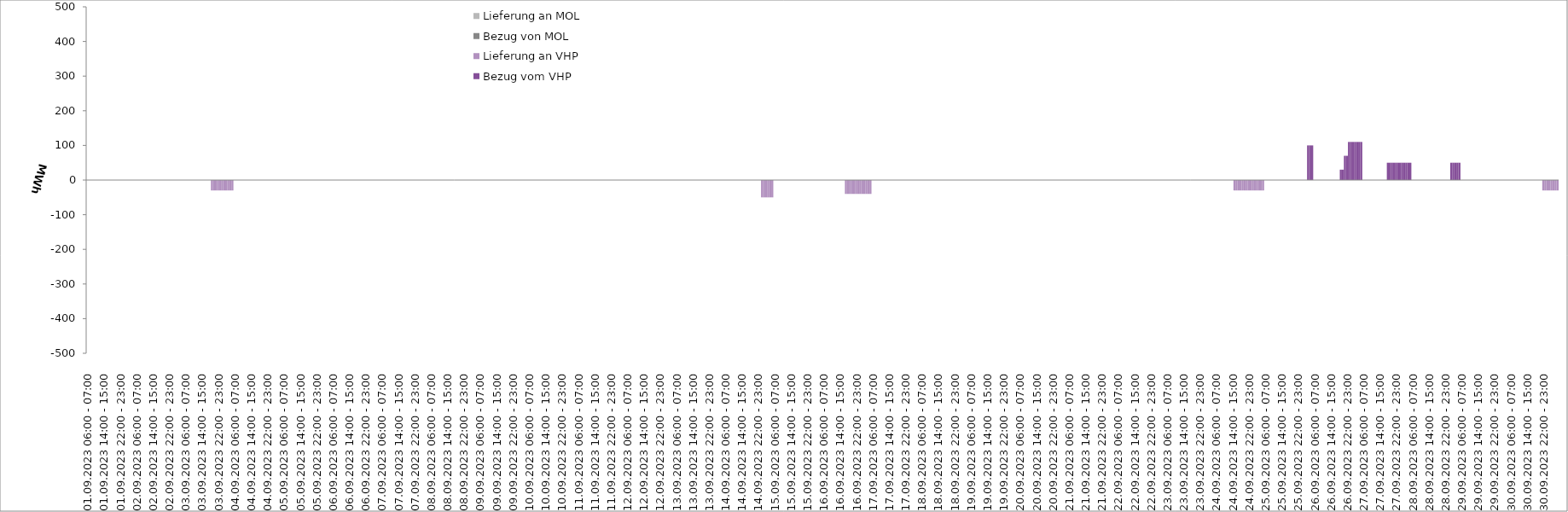
| Category | Bezug vom VHP | Lieferung an VHP | Bezug von MOL | Lieferung an MOL |
|---|---|---|---|---|
| 01.09.2023 06:00 - 07:00 | 0 | 0 | 0 | 0 |
| 01.09.2023 07:00 - 08:00 | 0 | 0 | 0 | 0 |
| 01.09.2023 08:00 - 09:00 | 0 | 0 | 0 | 0 |
| 01.09.2023 09:00 - 10:00 | 0 | 0 | 0 | 0 |
| 01.09.2023 10:00 - 11:00 | 0 | 0 | 0 | 0 |
| 01.09.2023 11:00 - 12:00 | 0 | 0 | 0 | 0 |
| 01.09.2023 12:00 - 13:00 | 0 | 0 | 0 | 0 |
| 01.09.2023 13:00 - 14:00 | 0 | 0 | 0 | 0 |
| 01.09.2023 14:00 - 15:00 | 0 | 0 | 0 | 0 |
| 01.09.2023 15:00 - 16:00 | 0 | 0 | 0 | 0 |
| 01.09.2023 16:00 - 17:00 | 0 | 0 | 0 | 0 |
| 01.09.2023 17:00 - 18:00 | 0 | 0 | 0 | 0 |
| 01.09.2023 18:00 - 19:00 | 0 | 0 | 0 | 0 |
| 01.09.2023 19:00 - 20:00 | 0 | 0 | 0 | 0 |
| 01.09.2023 20:00 - 21:00 | 0 | 0 | 0 | 0 |
| 01.09.2023 21:00 - 22:00 | 0 | 0 | 0 | 0 |
| 01.09.2023 22:00 - 23:00 | 0 | 0 | 0 | 0 |
| 01.09.2023 23:00 - 24:00 | 0 | 0 | 0 | 0 |
| 02.09.2023 00:00 - 01:00 | 0 | 0 | 0 | 0 |
| 02.09.2023 01:00 - 02:00 | 0 | 0 | 0 | 0 |
| 02.09.2023 02:00 - 03:00 | 0 | 0 | 0 | 0 |
| 02.09.2023 03:00 - 04:00 | 0 | 0 | 0 | 0 |
| 02.09.2023 04:00 - 05:00 | 0 | 0 | 0 | 0 |
| 02.09.2023 05:00 - 06:00 | 0 | 0 | 0 | 0 |
| 02.09.2023 06:00 - 07:00 | 0 | 0 | 0 | 0 |
| 02.09.2023 07:00 - 08:00 | 0 | 0 | 0 | 0 |
| 02.09.2023 08:00 - 09:00 | 0 | 0 | 0 | 0 |
| 02.09.2023 09:00 - 10:00 | 0 | 0 | 0 | 0 |
| 02.09.2023 10:00 - 11:00 | 0 | 0 | 0 | 0 |
| 02.09.2023 11:00 - 12:00 | 0 | 0 | 0 | 0 |
| 02.09.2023 12:00 - 13:00 | 0 | 0 | 0 | 0 |
| 02.09.2023 13:00 - 14:00 | 0 | 0 | 0 | 0 |
| 02.09.2023 14:00 - 15:00 | 0 | 0 | 0 | 0 |
| 02.09.2023 15:00 - 16:00 | 0 | 0 | 0 | 0 |
| 02.09.2023 16:00 - 17:00 | 0 | 0 | 0 | 0 |
| 02.09.2023 17:00 - 18:00 | 0 | 0 | 0 | 0 |
| 02.09.2023 18:00 - 19:00 | 0 | 0 | 0 | 0 |
| 02.09.2023 19:00 - 20:00 | 0 | 0 | 0 | 0 |
| 02.09.2023 20:00 - 21:00 | 0 | 0 | 0 | 0 |
| 02.09.2023 21:00 - 22:00 | 0 | 0 | 0 | 0 |
| 02.09.2023 22:00 - 23:00 | 0 | 0 | 0 | 0 |
| 02.09.2023 23:00 - 24:00 | 0 | 0 | 0 | 0 |
| 03.09.2023 00:00 - 01:00 | 0 | 0 | 0 | 0 |
| 03.09.2023 01:00 - 02:00 | 0 | 0 | 0 | 0 |
| 03.09.2023 02:00 - 03:00 | 0 | 0 | 0 | 0 |
| 03.09.2023 03:00 - 04:00 | 0 | 0 | 0 | 0 |
| 03.09.2023 04:00 - 05:00 | 0 | 0 | 0 | 0 |
| 03.09.2023 05:00 - 06:00 | 0 | 0 | 0 | 0 |
| 03.09.2023 06:00 - 07:00 | 0 | 0 | 0 | 0 |
| 03.09.2023 07:00 - 08:00 | 0 | 0 | 0 | 0 |
| 03.09.2023 08:00 - 09:00 | 0 | 0 | 0 | 0 |
| 03.09.2023 09:00 - 10:00 | 0 | 0 | 0 | 0 |
| 03.09.2023 10:00 - 11:00 | 0 | 0 | 0 | 0 |
| 03.09.2023 11:00 - 12:00 | 0 | 0 | 0 | 0 |
| 03.09.2023 12:00 - 13:00 | 0 | 0 | 0 | 0 |
| 03.09.2023 13:00 - 14:00 | 0 | 0 | 0 | 0 |
| 03.09.2023 14:00 - 15:00 | 0 | 0 | 0 | 0 |
| 03.09.2023 15:00 - 16:00 | 0 | 0 | 0 | 0 |
| 03.09.2023 16:00 - 17:00 | 0 | 0 | 0 | 0 |
| 03.09.2023 17:00 - 18:00 | 0 | 0 | 0 | 0 |
| 03.09.2023 18:00 - 19:00 | 0 | 0 | 0 | 0 |
| 03.09.2023 19:00 - 20:00 | 0 | -30 | 0 | 0 |
| 03.09.2023 20:00 - 21:00 | 0 | -30 | 0 | 0 |
| 03.09.2023 21:00 - 22:00 | 0 | -30 | 0 | 0 |
| 03.09.2023 22:00 - 23:00 | 0 | -30 | 0 | 0 |
| 03.09.2023 23:00 - 24:00 | 0 | -30 | 0 | 0 |
| 04.09.2023 00:00 - 01:00 | 0 | -30 | 0 | 0 |
| 04.09.2023 01:00 - 02:00 | 0 | -30 | 0 | 0 |
| 04.09.2023 02:00 - 03:00 | 0 | -30 | 0 | 0 |
| 04.09.2023 03:00 - 04:00 | 0 | -30 | 0 | 0 |
| 04.09.2023 04:00 - 05:00 | 0 | -30 | 0 | 0 |
| 04.09.2023 05:00 - 06:00 | 0 | -30 | 0 | 0 |
| 04.09.2023 06:00 - 07:00 | 0 | 0 | 0 | 0 |
| 04.09.2023 07:00 - 08:00 | 0 | 0 | 0 | 0 |
| 04.09.2023 08:00 - 09:00 | 0 | 0 | 0 | 0 |
| 04.09.2023 09:00 - 10:00 | 0 | 0 | 0 | 0 |
| 04.09.2023 10:00 - 11:00 | 0 | 0 | 0 | 0 |
| 04.09.2023 11:00 - 12:00 | 0 | 0 | 0 | 0 |
| 04.09.2023 12:00 - 13:00 | 0 | 0 | 0 | 0 |
| 04.09.2023 13:00 - 14:00 | 0 | 0 | 0 | 0 |
| 04.09.2023 14:00 - 15:00 | 0 | 0 | 0 | 0 |
| 04.09.2023 15:00 - 16:00 | 0 | 0 | 0 | 0 |
| 04.09.2023 16:00 - 17:00 | 0 | 0 | 0 | 0 |
| 04.09.2023 17:00 - 18:00 | 0 | 0 | 0 | 0 |
| 04.09.2023 18:00 - 19:00 | 0 | 0 | 0 | 0 |
| 04.09.2023 19:00 - 20:00 | 0 | 0 | 0 | 0 |
| 04.09.2023 20:00 - 21:00 | 0 | 0 | 0 | 0 |
| 04.09.2023 21:00 - 22:00 | 0 | 0 | 0 | 0 |
| 04.09.2023 22:00 - 23:00 | 0 | 0 | 0 | 0 |
| 04.09.2023 23:00 - 24:00 | 0 | 0 | 0 | 0 |
| 05.09.2023 00:00 - 01:00 | 0 | 0 | 0 | 0 |
| 05.09.2023 01:00 - 02:00 | 0 | 0 | 0 | 0 |
| 05.09.2023 02:00 - 03:00 | 0 | 0 | 0 | 0 |
| 05.09.2023 03:00 - 04:00 | 0 | 0 | 0 | 0 |
| 05.09.2023 04:00 - 05:00 | 0 | 0 | 0 | 0 |
| 05.09.2023 05:00 - 06:00 | 0 | 0 | 0 | 0 |
| 05.09.2023 06:00 - 07:00 | 0 | 0 | 0 | 0 |
| 05.09.2023 07:00 - 08:00 | 0 | 0 | 0 | 0 |
| 05.09.2023 08:00 - 09:00 | 0 | 0 | 0 | 0 |
| 05.09.2023 09:00 - 10:00 | 0 | 0 | 0 | 0 |
| 05.09.2023 10:00 - 11:00 | 0 | 0 | 0 | 0 |
| 05.09.2023 11:00 - 12:00 | 0 | 0 | 0 | 0 |
| 05.09.2023 12:00 - 13:00 | 0 | 0 | 0 | 0 |
| 05.09.2023 13:00 - 14:00 | 0 | 0 | 0 | 0 |
| 05.09.2023 14:00 - 15:00 | 0 | 0 | 0 | 0 |
| 05.09.2023 15:00 - 16:00 | 0 | 0 | 0 | 0 |
| 05.09.2023 16:00 - 17:00 | 0 | 0 | 0 | 0 |
| 05.09.2023 17:00 - 18:00 | 0 | 0 | 0 | 0 |
| 05.09.2023 18:00 - 19:00 | 0 | 0 | 0 | 0 |
| 05.09.2023 19:00 - 20:00 | 0 | 0 | 0 | 0 |
| 05.09.2023 20:00 - 21:00 | 0 | 0 | 0 | 0 |
| 05.09.2023 21:00 - 22:00 | 0 | 0 | 0 | 0 |
| 05.09.2023 22:00 - 23:00 | 0 | 0 | 0 | 0 |
| 05.09.2023 23:00 - 24:00 | 0 | 0 | 0 | 0 |
| 06.09.2023 00:00 - 01:00 | 0 | 0 | 0 | 0 |
| 06.09.2023 01:00 - 02:00 | 0 | 0 | 0 | 0 |
| 06.09.2023 02:00 - 03:00 | 0 | 0 | 0 | 0 |
| 06.09.2023 03:00 - 04:00 | 0 | 0 | 0 | 0 |
| 06.09.2023 04:00 - 05:00 | 0 | 0 | 0 | 0 |
| 06.09.2023 05:00 - 06:00 | 0 | 0 | 0 | 0 |
| 06.09.2023 06:00 - 07:00 | 0 | 0 | 0 | 0 |
| 06.09.2023 07:00 - 08:00 | 0 | 0 | 0 | 0 |
| 06.09.2023 08:00 - 09:00 | 0 | 0 | 0 | 0 |
| 06.09.2023 09:00 - 10:00 | 0 | 0 | 0 | 0 |
| 06.09.2023 10:00 - 11:00 | 0 | 0 | 0 | 0 |
| 06.09.2023 11:00 - 12:00 | 0 | 0 | 0 | 0 |
| 06.09.2023 12:00 - 13:00 | 0 | 0 | 0 | 0 |
| 06.09.2023 13:00 - 14:00 | 0 | 0 | 0 | 0 |
| 06.09.2023 14:00 - 15:00 | 0 | 0 | 0 | 0 |
| 06.09.2023 15:00 - 16:00 | 0 | 0 | 0 | 0 |
| 06.09.2023 16:00 - 17:00 | 0 | 0 | 0 | 0 |
| 06.09.2023 17:00 - 18:00 | 0 | 0 | 0 | 0 |
| 06.09.2023 18:00 - 19:00 | 0 | 0 | 0 | 0 |
| 06.09.2023 19:00 - 20:00 | 0 | 0 | 0 | 0 |
| 06.09.2023 20:00 - 21:00 | 0 | 0 | 0 | 0 |
| 06.09.2023 21:00 - 22:00 | 0 | 0 | 0 | 0 |
| 06.09.2023 22:00 - 23:00 | 0 | 0 | 0 | 0 |
| 06.09.2023 23:00 - 24:00 | 0 | 0 | 0 | 0 |
| 07.09.2023 00:00 - 01:00 | 0 | 0 | 0 | 0 |
| 07.09.2023 01:00 - 02:00 | 0 | 0 | 0 | 0 |
| 07.09.2023 02:00 - 03:00 | 0 | 0 | 0 | 0 |
| 07.09.2023 03:00 - 04:00 | 0 | 0 | 0 | 0 |
| 07.09.2023 04:00 - 05:00 | 0 | 0 | 0 | 0 |
| 07.09.2023 05:00 - 06:00 | 0 | 0 | 0 | 0 |
| 07.09.2023 06:00 - 07:00 | 0 | 0 | 0 | 0 |
| 07.09.2023 07:00 - 08:00 | 0 | 0 | 0 | 0 |
| 07.09.2023 08:00 - 09:00 | 0 | 0 | 0 | 0 |
| 07.09.2023 09:00 - 10:00 | 0 | 0 | 0 | 0 |
| 07.09.2023 10:00 - 11:00 | 0 | 0 | 0 | 0 |
| 07.09.2023 11:00 - 12:00 | 0 | 0 | 0 | 0 |
| 07.09.2023 12:00 - 13:00 | 0 | 0 | 0 | 0 |
| 07.09.2023 13:00 - 14:00 | 0 | 0 | 0 | 0 |
| 07.09.2023 14:00 - 15:00 | 0 | 0 | 0 | 0 |
| 07.09.2023 15:00 - 16:00 | 0 | 0 | 0 | 0 |
| 07.09.2023 16:00 - 17:00 | 0 | 0 | 0 | 0 |
| 07.09.2023 17:00 - 18:00 | 0 | 0 | 0 | 0 |
| 07.09.2023 18:00 - 19:00 | 0 | 0 | 0 | 0 |
| 07.09.2023 19:00 - 20:00 | 0 | 0 | 0 | 0 |
| 07.09.2023 20:00 - 21:00 | 0 | 0 | 0 | 0 |
| 07.09.2023 21:00 - 22:00 | 0 | 0 | 0 | 0 |
| 07.09.2023 22:00 - 23:00 | 0 | 0 | 0 | 0 |
| 07.09.2023 23:00 - 24:00 | 0 | 0 | 0 | 0 |
| 08.09.2023 00:00 - 01:00 | 0 | 0 | 0 | 0 |
| 08.09.2023 01:00 - 02:00 | 0 | 0 | 0 | 0 |
| 08.09.2023 02:00 - 03:00 | 0 | 0 | 0 | 0 |
| 08.09.2023 03:00 - 04:00 | 0 | 0 | 0 | 0 |
| 08.09.2023 04:00 - 05:00 | 0 | 0 | 0 | 0 |
| 08.09.2023 05:00 - 06:00 | 0 | 0 | 0 | 0 |
| 08.09.2023 06:00 - 07:00 | 0 | 0 | 0 | 0 |
| 08.09.2023 07:00 - 08:00 | 0 | 0 | 0 | 0 |
| 08.09.2023 08:00 - 09:00 | 0 | 0 | 0 | 0 |
| 08.09.2023 09:00 - 10:00 | 0 | 0 | 0 | 0 |
| 08.09.2023 10:00 - 11:00 | 0 | 0 | 0 | 0 |
| 08.09.2023 11:00 - 12:00 | 0 | 0 | 0 | 0 |
| 08.09.2023 12:00 - 13:00 | 0 | 0 | 0 | 0 |
| 08.09.2023 13:00 - 14:00 | 0 | 0 | 0 | 0 |
| 08.09.2023 14:00 - 15:00 | 0 | 0 | 0 | 0 |
| 08.09.2023 15:00 - 16:00 | 0 | 0 | 0 | 0 |
| 08.09.2023 16:00 - 17:00 | 0 | 0 | 0 | 0 |
| 08.09.2023 17:00 - 18:00 | 0 | 0 | 0 | 0 |
| 08.09.2023 18:00 - 19:00 | 0 | 0 | 0 | 0 |
| 08.09.2023 19:00 - 20:00 | 0 | 0 | 0 | 0 |
| 08.09.2023 20:00 - 21:00 | 0 | 0 | 0 | 0 |
| 08.09.2023 21:00 - 22:00 | 0 | 0 | 0 | 0 |
| 08.09.2023 22:00 - 23:00 | 0 | 0 | 0 | 0 |
| 08.09.2023 23:00 - 24:00 | 0 | 0 | 0 | 0 |
| 09.09.2023 00:00 - 01:00 | 0 | 0 | 0 | 0 |
| 09.09.2023 01:00 - 02:00 | 0 | 0 | 0 | 0 |
| 09.09.2023 02:00 - 03:00 | 0 | 0 | 0 | 0 |
| 09.09.2023 03:00 - 04:00 | 0 | 0 | 0 | 0 |
| 09.09.2023 04:00 - 05:00 | 0 | 0 | 0 | 0 |
| 09.09.2023 05:00 - 06:00 | 0 | 0 | 0 | 0 |
| 09.09.2023 06:00 - 07:00 | 0 | 0 | 0 | 0 |
| 09.09.2023 07:00 - 08:00 | 0 | 0 | 0 | 0 |
| 09.09.2023 08:00 - 09:00 | 0 | 0 | 0 | 0 |
| 09.09.2023 09:00 - 10:00 | 0 | 0 | 0 | 0 |
| 09.09.2023 10:00 - 11:00 | 0 | 0 | 0 | 0 |
| 09.09.2023 11:00 - 12:00 | 0 | 0 | 0 | 0 |
| 09.09.2023 12:00 - 13:00 | 0 | 0 | 0 | 0 |
| 09.09.2023 13:00 - 14:00 | 0 | 0 | 0 | 0 |
| 09.09.2023 14:00 - 15:00 | 0 | 0 | 0 | 0 |
| 09.09.2023 15:00 - 16:00 | 0 | 0 | 0 | 0 |
| 09.09.2023 16:00 - 17:00 | 0 | 0 | 0 | 0 |
| 09.09.2023 17:00 - 18:00 | 0 | 0 | 0 | 0 |
| 09.09.2023 18:00 - 19:00 | 0 | 0 | 0 | 0 |
| 09.09.2023 19:00 - 20:00 | 0 | 0 | 0 | 0 |
| 09.09.2023 20:00 - 21:00 | 0 | 0 | 0 | 0 |
| 09.09.2023 21:00 - 22:00 | 0 | 0 | 0 | 0 |
| 09.09.2023 22:00 - 23:00 | 0 | 0 | 0 | 0 |
| 09.09.2023 23:00 - 24:00 | 0 | 0 | 0 | 0 |
| 10.09.2023 00:00 - 01:00 | 0 | 0 | 0 | 0 |
| 10.09.2023 01:00 - 02:00 | 0 | 0 | 0 | 0 |
| 10.09.2023 02:00 - 03:00 | 0 | 0 | 0 | 0 |
| 10.09.2023 03:00 - 04:00 | 0 | 0 | 0 | 0 |
| 10.09.2023 04:00 - 05:00 | 0 | 0 | 0 | 0 |
| 10.09.2023 05:00 - 06:00 | 0 | 0 | 0 | 0 |
| 10.09.2023 06:00 - 07:00 | 0 | 0 | 0 | 0 |
| 10.09.2023 07:00 - 08:00 | 0 | 0 | 0 | 0 |
| 10.09.2023 08:00 - 09:00 | 0 | 0 | 0 | 0 |
| 10.09.2023 09:00 - 10:00 | 0 | 0 | 0 | 0 |
| 10.09.2023 10:00 - 11:00 | 0 | 0 | 0 | 0 |
| 10.09.2023 11:00 - 12:00 | 0 | 0 | 0 | 0 |
| 10.09.2023 12:00 - 13:00 | 0 | 0 | 0 | 0 |
| 10.09.2023 13:00 - 14:00 | 0 | 0 | 0 | 0 |
| 10.09.2023 14:00 - 15:00 | 0 | 0 | 0 | 0 |
| 10.09.2023 15:00 - 16:00 | 0 | 0 | 0 | 0 |
| 10.09.2023 16:00 - 17:00 | 0 | 0 | 0 | 0 |
| 10.09.2023 17:00 - 18:00 | 0 | 0 | 0 | 0 |
| 10.09.2023 18:00 - 19:00 | 0 | 0 | 0 | 0 |
| 10.09.2023 19:00 - 20:00 | 0 | 0 | 0 | 0 |
| 10.09.2023 20:00 - 21:00 | 0 | 0 | 0 | 0 |
| 10.09.2023 21:00 - 22:00 | 0 | 0 | 0 | 0 |
| 10.09.2023 22:00 - 23:00 | 0 | 0 | 0 | 0 |
| 10.09.2023 23:00 - 24:00 | 0 | 0 | 0 | 0 |
| 11.09.2023 00:00 - 01:00 | 0 | 0 | 0 | 0 |
| 11.09.2023 01:00 - 02:00 | 0 | 0 | 0 | 0 |
| 11.09.2023 02:00 - 03:00 | 0 | 0 | 0 | 0 |
| 11.09.2023 03:00 - 04:00 | 0 | 0 | 0 | 0 |
| 11.09.2023 04:00 - 05:00 | 0 | 0 | 0 | 0 |
| 11.09.2023 05:00 - 06:00 | 0 | 0 | 0 | 0 |
| 11.09.2023 06:00 - 07:00 | 0 | 0 | 0 | 0 |
| 11.09.2023 07:00 - 08:00 | 0 | 0 | 0 | 0 |
| 11.09.2023 08:00 - 09:00 | 0 | 0 | 0 | 0 |
| 11.09.2023 09:00 - 10:00 | 0 | 0 | 0 | 0 |
| 11.09.2023 10:00 - 11:00 | 0 | 0 | 0 | 0 |
| 11.09.2023 11:00 - 12:00 | 0 | 0 | 0 | 0 |
| 11.09.2023 12:00 - 13:00 | 0 | 0 | 0 | 0 |
| 11.09.2023 13:00 - 14:00 | 0 | 0 | 0 | 0 |
| 11.09.2023 14:00 - 15:00 | 0 | 0 | 0 | 0 |
| 11.09.2023 15:00 - 16:00 | 0 | 0 | 0 | 0 |
| 11.09.2023 16:00 - 17:00 | 0 | 0 | 0 | 0 |
| 11.09.2023 17:00 - 18:00 | 0 | 0 | 0 | 0 |
| 11.09.2023 18:00 - 19:00 | 0 | 0 | 0 | 0 |
| 11.09.2023 19:00 - 20:00 | 0 | 0 | 0 | 0 |
| 11.09.2023 20:00 - 21:00 | 0 | 0 | 0 | 0 |
| 11.09.2023 21:00 - 22:00 | 0 | 0 | 0 | 0 |
| 11.09.2023 22:00 - 23:00 | 0 | 0 | 0 | 0 |
| 11.09.2023 23:00 - 24:00 | 0 | 0 | 0 | 0 |
| 12.09.2023 00:00 - 01:00 | 0 | 0 | 0 | 0 |
| 12.09.2023 01:00 - 02:00 | 0 | 0 | 0 | 0 |
| 12.09.2023 02:00 - 03:00 | 0 | 0 | 0 | 0 |
| 12.09.2023 03:00 - 04:00 | 0 | 0 | 0 | 0 |
| 12.09.2023 04:00 - 05:00 | 0 | 0 | 0 | 0 |
| 12.09.2023 05:00 - 06:00 | 0 | 0 | 0 | 0 |
| 12.09.2023 06:00 - 07:00 | 0 | 0 | 0 | 0 |
| 12.09.2023 07:00 - 08:00 | 0 | 0 | 0 | 0 |
| 12.09.2023 08:00 - 09:00 | 0 | 0 | 0 | 0 |
| 12.09.2023 09:00 - 10:00 | 0 | 0 | 0 | 0 |
| 12.09.2023 10:00 - 11:00 | 0 | 0 | 0 | 0 |
| 12.09.2023 11:00 - 12:00 | 0 | 0 | 0 | 0 |
| 12.09.2023 12:00 - 13:00 | 0 | 0 | 0 | 0 |
| 12.09.2023 13:00 - 14:00 | 0 | 0 | 0 | 0 |
| 12.09.2023 14:00 - 15:00 | 0 | 0 | 0 | 0 |
| 12.09.2023 15:00 - 16:00 | 0 | 0 | 0 | 0 |
| 12.09.2023 16:00 - 17:00 | 0 | 0 | 0 | 0 |
| 12.09.2023 17:00 - 18:00 | 0 | 0 | 0 | 0 |
| 12.09.2023 18:00 - 19:00 | 0 | 0 | 0 | 0 |
| 12.09.2023 19:00 - 20:00 | 0 | 0 | 0 | 0 |
| 12.09.2023 20:00 - 21:00 | 0 | 0 | 0 | 0 |
| 12.09.2023 21:00 - 22:00 | 0 | 0 | 0 | 0 |
| 12.09.2023 22:00 - 23:00 | 0 | 0 | 0 | 0 |
| 12.09.2023 23:00 - 24:00 | 0 | 0 | 0 | 0 |
| 13.09.2023 00:00 - 01:00 | 0 | 0 | 0 | 0 |
| 13.09.2023 01:00 - 02:00 | 0 | 0 | 0 | 0 |
| 13.09.2023 02:00 - 03:00 | 0 | 0 | 0 | 0 |
| 13.09.2023 03:00 - 04:00 | 0 | 0 | 0 | 0 |
| 13.09.2023 04:00 - 05:00 | 0 | 0 | 0 | 0 |
| 13.09.2023 05:00 - 06:00 | 0 | 0 | 0 | 0 |
| 13.09.2023 06:00 - 07:00 | 0 | 0 | 0 | 0 |
| 13.09.2023 07:00 - 08:00 | 0 | 0 | 0 | 0 |
| 13.09.2023 08:00 - 09:00 | 0 | 0 | 0 | 0 |
| 13.09.2023 09:00 - 10:00 | 0 | 0 | 0 | 0 |
| 13.09.2023 10:00 - 11:00 | 0 | 0 | 0 | 0 |
| 13.09.2023 11:00 - 12:00 | 0 | 0 | 0 | 0 |
| 13.09.2023 12:00 - 13:00 | 0 | 0 | 0 | 0 |
| 13.09.2023 13:00 - 14:00 | 0 | 0 | 0 | 0 |
| 13.09.2023 14:00 - 15:00 | 0 | 0 | 0 | 0 |
| 13.09.2023 15:00 - 16:00 | 0 | 0 | 0 | 0 |
| 13.09.2023 16:00 - 17:00 | 0 | 0 | 0 | 0 |
| 13.09.2023 17:00 - 18:00 | 0 | 0 | 0 | 0 |
| 13.09.2023 18:00 - 19:00 | 0 | 0 | 0 | 0 |
| 13.09.2023 19:00 - 20:00 | 0 | 0 | 0 | 0 |
| 13.09.2023 20:00 - 21:00 | 0 | 0 | 0 | 0 |
| 13.09.2023 21:00 - 22:00 | 0 | 0 | 0 | 0 |
| 13.09.2023 22:00 - 23:00 | 0 | 0 | 0 | 0 |
| 13.09.2023 23:00 - 24:00 | 0 | 0 | 0 | 0 |
| 14.09.2023 00:00 - 01:00 | 0 | 0 | 0 | 0 |
| 14.09.2023 01:00 - 02:00 | 0 | 0 | 0 | 0 |
| 14.09.2023 02:00 - 03:00 | 0 | 0 | 0 | 0 |
| 14.09.2023 03:00 - 04:00 | 0 | 0 | 0 | 0 |
| 14.09.2023 04:00 - 05:00 | 0 | 0 | 0 | 0 |
| 14.09.2023 05:00 - 06:00 | 0 | 0 | 0 | 0 |
| 14.09.2023 06:00 - 07:00 | 0 | 0 | 0 | 0 |
| 14.09.2023 07:00 - 08:00 | 0 | 0 | 0 | 0 |
| 14.09.2023 08:00 - 09:00 | 0 | 0 | 0 | 0 |
| 14.09.2023 09:00 - 10:00 | 0 | 0 | 0 | 0 |
| 14.09.2023 10:00 - 11:00 | 0 | 0 | 0 | 0 |
| 14.09.2023 11:00 - 12:00 | 0 | 0 | 0 | 0 |
| 14.09.2023 12:00 - 13:00 | 0 | 0 | 0 | 0 |
| 14.09.2023 13:00 - 14:00 | 0 | 0 | 0 | 0 |
| 14.09.2023 14:00 - 15:00 | 0 | 0 | 0 | 0 |
| 14.09.2023 15:00 - 16:00 | 0 | 0 | 0 | 0 |
| 14.09.2023 16:00 - 17:00 | 0 | 0 | 0 | 0 |
| 14.09.2023 17:00 - 18:00 | 0 | 0 | 0 | 0 |
| 14.09.2023 18:00 - 19:00 | 0 | 0 | 0 | 0 |
| 14.09.2023 19:00 - 20:00 | 0 | 0 | 0 | 0 |
| 14.09.2023 20:00 - 21:00 | 0 | 0 | 0 | 0 |
| 14.09.2023 21:00 - 22:00 | 0 | 0 | 0 | 0 |
| 14.09.2023 22:00 - 23:00 | 0 | 0 | 0 | 0 |
| 14.09.2023 23:00 - 24:00 | 0 | 0 | 0 | 0 |
| 15.09.2023 00:00 - 01:00 | 0 | -50 | 0 | 0 |
| 15.09.2023 01:00 - 02:00 | 0 | -50 | 0 | 0 |
| 15.09.2023 02:00 - 03:00 | 0 | -50 | 0 | 0 |
| 15.09.2023 03:00 - 04:00 | 0 | -50 | 0 | 0 |
| 15.09.2023 04:00 - 05:00 | 0 | -50 | 0 | 0 |
| 15.09.2023 05:00 - 06:00 | 0 | -50 | 0 | 0 |
| 15.09.2023 06:00 - 07:00 | 0 | 0 | 0 | 0 |
| 15.09.2023 07:00 - 08:00 | 0 | 0 | 0 | 0 |
| 15.09.2023 08:00 - 09:00 | 0 | 0 | 0 | 0 |
| 15.09.2023 09:00 - 10:00 | 0 | 0 | 0 | 0 |
| 15.09.2023 10:00 - 11:00 | 0 | 0 | 0 | 0 |
| 15.09.2023 11:00 - 12:00 | 0 | 0 | 0 | 0 |
| 15.09.2023 12:00 - 13:00 | 0 | 0 | 0 | 0 |
| 15.09.2023 13:00 - 14:00 | 0 | 0 | 0 | 0 |
| 15.09.2023 14:00 - 15:00 | 0 | 0 | 0 | 0 |
| 15.09.2023 15:00 - 16:00 | 0 | 0 | 0 | 0 |
| 15.09.2023 16:00 - 17:00 | 0 | 0 | 0 | 0 |
| 15.09.2023 17:00 - 18:00 | 0 | 0 | 0 | 0 |
| 15.09.2023 18:00 - 19:00 | 0 | 0 | 0 | 0 |
| 15.09.2023 19:00 - 20:00 | 0 | 0 | 0 | 0 |
| 15.09.2023 20:00 - 21:00 | 0 | 0 | 0 | 0 |
| 15.09.2023 21:00 - 22:00 | 0 | 0 | 0 | 0 |
| 15.09.2023 22:00 - 23:00 | 0 | 0 | 0 | 0 |
| 15.09.2023 23:00 - 24:00 | 0 | 0 | 0 | 0 |
| 16.09.2023 00:00 - 01:00 | 0 | 0 | 0 | 0 |
| 16.09.2023 01:00 - 02:00 | 0 | 0 | 0 | 0 |
| 16.09.2023 02:00 - 03:00 | 0 | 0 | 0 | 0 |
| 16.09.2023 03:00 - 04:00 | 0 | 0 | 0 | 0 |
| 16.09.2023 04:00 - 05:00 | 0 | 0 | 0 | 0 |
| 16.09.2023 05:00 - 06:00 | 0 | 0 | 0 | 0 |
| 16.09.2023 06:00 - 07:00 | 0 | 0 | 0 | 0 |
| 16.09.2023 07:00 - 08:00 | 0 | 0 | 0 | 0 |
| 16.09.2023 08:00 - 09:00 | 0 | 0 | 0 | 0 |
| 16.09.2023 09:00 - 10:00 | 0 | 0 | 0 | 0 |
| 16.09.2023 10:00 - 11:00 | 0 | 0 | 0 | 0 |
| 16.09.2023 11:00 - 12:00 | 0 | 0 | 0 | 0 |
| 16.09.2023 12:00 - 13:00 | 0 | 0 | 0 | 0 |
| 16.09.2023 13:00 - 14:00 | 0 | 0 | 0 | 0 |
| 16.09.2023 14:00 - 15:00 | 0 | 0 | 0 | 0 |
| 16.09.2023 15:00 - 16:00 | 0 | 0 | 0 | 0 |
| 16.09.2023 16:00 - 17:00 | 0 | 0 | 0 | 0 |
| 16.09.2023 17:00 - 18:00 | 0 | -40 | 0 | 0 |
| 16.09.2023 18:00 - 19:00 | 0 | -40 | 0 | 0 |
| 16.09.2023 19:00 - 20:00 | 0 | -40 | 0 | 0 |
| 16.09.2023 20:00 - 21:00 | 0 | -40 | 0 | 0 |
| 16.09.2023 21:00 - 22:00 | 0 | -40 | 0 | 0 |
| 16.09.2023 22:00 - 23:00 | 0 | -40 | 0 | 0 |
| 16.09.2023 23:00 - 24:00 | 0 | -40 | 0 | 0 |
| 17.09.2023 00:00 - 01:00 | 0 | -40 | 0 | 0 |
| 17.09.2023 01:00 - 02:00 | 0 | -40 | 0 | 0 |
| 17.09.2023 02:00 - 03:00 | 0 | -40 | 0 | 0 |
| 17.09.2023 03:00 - 04:00 | 0 | -40 | 0 | 0 |
| 17.09.2023 04:00 - 05:00 | 0 | -40 | 0 | 0 |
| 17.09.2023 05:00 - 06:00 | 0 | -40 | 0 | 0 |
| 17.09.2023 06:00 - 07:00 | 0 | 0 | 0 | 0 |
| 17.09.2023 07:00 - 08:00 | 0 | 0 | 0 | 0 |
| 17.09.2023 08:00 - 09:00 | 0 | 0 | 0 | 0 |
| 17.09.2023 09:00 - 10:00 | 0 | 0 | 0 | 0 |
| 17.09.2023 10:00 - 11:00 | 0 | 0 | 0 | 0 |
| 17.09.2023 11:00 - 12:00 | 0 | 0 | 0 | 0 |
| 17.09.2023 12:00 - 13:00 | 0 | 0 | 0 | 0 |
| 17.09.2023 13:00 - 14:00 | 0 | 0 | 0 | 0 |
| 17.09.2023 14:00 - 15:00 | 0 | 0 | 0 | 0 |
| 17.09.2023 15:00 - 16:00 | 0 | 0 | 0 | 0 |
| 17.09.2023 16:00 - 17:00 | 0 | 0 | 0 | 0 |
| 17.09.2023 17:00 - 18:00 | 0 | 0 | 0 | 0 |
| 17.09.2023 18:00 - 19:00 | 0 | 0 | 0 | 0 |
| 17.09.2023 19:00 - 20:00 | 0 | 0 | 0 | 0 |
| 17.09.2023 20:00 - 21:00 | 0 | 0 | 0 | 0 |
| 17.09.2023 21:00 - 22:00 | 0 | 0 | 0 | 0 |
| 17.09.2023 22:00 - 23:00 | 0 | 0 | 0 | 0 |
| 17.09.2023 23:00 - 24:00 | 0 | 0 | 0 | 0 |
| 18.09.2023 00:00 - 01:00 | 0 | 0 | 0 | 0 |
| 18.09.2023 01:00 - 02:00 | 0 | 0 | 0 | 0 |
| 18.09.2023 02:00 - 03:00 | 0 | 0 | 0 | 0 |
| 18.09.2023 03:00 - 04:00 | 0 | 0 | 0 | 0 |
| 18.09.2023 04:00 - 05:00 | 0 | 0 | 0 | 0 |
| 18.09.2023 05:00 - 06:00 | 0 | 0 | 0 | 0 |
| 18.09.2023 06:00 - 07:00 | 0 | 0 | 0 | 0 |
| 18.09.2023 07:00 - 08:00 | 0 | 0 | 0 | 0 |
| 18.09.2023 08:00 - 09:00 | 0 | 0 | 0 | 0 |
| 18.09.2023 09:00 - 10:00 | 0 | 0 | 0 | 0 |
| 18.09.2023 10:00 - 11:00 | 0 | 0 | 0 | 0 |
| 18.09.2023 11:00 - 12:00 | 0 | 0 | 0 | 0 |
| 18.09.2023 12:00 - 13:00 | 0 | 0 | 0 | 0 |
| 18.09.2023 13:00 - 14:00 | 0 | 0 | 0 | 0 |
| 18.09.2023 14:00 - 15:00 | 0 | 0 | 0 | 0 |
| 18.09.2023 15:00 - 16:00 | 0 | 0 | 0 | 0 |
| 18.09.2023 16:00 - 17:00 | 0 | 0 | 0 | 0 |
| 18.09.2023 17:00 - 18:00 | 0 | 0 | 0 | 0 |
| 18.09.2023 18:00 - 19:00 | 0 | 0 | 0 | 0 |
| 18.09.2023 19:00 - 20:00 | 0 | 0 | 0 | 0 |
| 18.09.2023 20:00 - 21:00 | 0 | 0 | 0 | 0 |
| 18.09.2023 21:00 - 22:00 | 0 | 0 | 0 | 0 |
| 18.09.2023 22:00 - 23:00 | 0 | 0 | 0 | 0 |
| 18.09.2023 23:00 - 24:00 | 0 | 0 | 0 | 0 |
| 19.09.2023 00:00 - 01:00 | 0 | 0 | 0 | 0 |
| 19.09.2023 01:00 - 02:00 | 0 | 0 | 0 | 0 |
| 19.09.2023 02:00 - 03:00 | 0 | 0 | 0 | 0 |
| 19.09.2023 03:00 - 04:00 | 0 | 0 | 0 | 0 |
| 19.09.2023 04:00 - 05:00 | 0 | 0 | 0 | 0 |
| 19.09.2023 05:00 - 06:00 | 0 | 0 | 0 | 0 |
| 19.09.2023 06:00 - 07:00 | 0 | 0 | 0 | 0 |
| 19.09.2023 07:00 - 08:00 | 0 | 0 | 0 | 0 |
| 19.09.2023 08:00 - 09:00 | 0 | 0 | 0 | 0 |
| 19.09.2023 09:00 - 10:00 | 0 | 0 | 0 | 0 |
| 19.09.2023 10:00 - 11:00 | 0 | 0 | 0 | 0 |
| 19.09.2023 11:00 - 12:00 | 0 | 0 | 0 | 0 |
| 19.09.2023 12:00 - 13:00 | 0 | 0 | 0 | 0 |
| 19.09.2023 13:00 - 14:00 | 0 | 0 | 0 | 0 |
| 19.09.2023 14:00 - 15:00 | 0 | 0 | 0 | 0 |
| 19.09.2023 15:00 - 16:00 | 0 | 0 | 0 | 0 |
| 19.09.2023 16:00 - 17:00 | 0 | 0 | 0 | 0 |
| 19.09.2023 17:00 - 18:00 | 0 | 0 | 0 | 0 |
| 19.09.2023 18:00 - 19:00 | 0 | 0 | 0 | 0 |
| 19.09.2023 19:00 - 20:00 | 0 | 0 | 0 | 0 |
| 19.09.2023 20:00 - 21:00 | 0 | 0 | 0 | 0 |
| 19.09.2023 21:00 - 22:00 | 0 | 0 | 0 | 0 |
| 19.09.2023 22:00 - 23:00 | 0 | 0 | 0 | 0 |
| 19.09.2023 23:00 - 24:00 | 0 | 0 | 0 | 0 |
| 20.09.2023 00:00 - 01:00 | 0 | 0 | 0 | 0 |
| 20.09.2023 01:00 - 02:00 | 0 | 0 | 0 | 0 |
| 20.09.2023 02:00 - 03:00 | 0 | 0 | 0 | 0 |
| 20.09.2023 03:00 - 04:00 | 0 | 0 | 0 | 0 |
| 20.09.2023 04:00 - 05:00 | 0 | 0 | 0 | 0 |
| 20.09.2023 05:00 - 06:00 | 0 | 0 | 0 | 0 |
| 20.09.2023 06:00 - 07:00 | 0 | 0 | 0 | 0 |
| 20.09.2023 07:00 - 08:00 | 0 | 0 | 0 | 0 |
| 20.09.2023 08:00 - 09:00 | 0 | 0 | 0 | 0 |
| 20.09.2023 09:00 - 10:00 | 0 | 0 | 0 | 0 |
| 20.09.2023 10:00 - 11:00 | 0 | 0 | 0 | 0 |
| 20.09.2023 11:00 - 12:00 | 0 | 0 | 0 | 0 |
| 20.09.2023 12:00 - 13:00 | 0 | 0 | 0 | 0 |
| 20.09.2023 13:00 - 14:00 | 0 | 0 | 0 | 0 |
| 20.09.2023 14:00 - 15:00 | 0 | 0 | 0 | 0 |
| 20.09.2023 15:00 - 16:00 | 0 | 0 | 0 | 0 |
| 20.09.2023 16:00 - 17:00 | 0 | 0 | 0 | 0 |
| 20.09.2023 17:00 - 18:00 | 0 | 0 | 0 | 0 |
| 20.09.2023 18:00 - 19:00 | 0 | 0 | 0 | 0 |
| 20.09.2023 19:00 - 20:00 | 0 | 0 | 0 | 0 |
| 20.09.2023 20:00 - 21:00 | 0 | 0 | 0 | 0 |
| 20.09.2023 21:00 - 22:00 | 0 | 0 | 0 | 0 |
| 20.09.2023 22:00 - 23:00 | 0 | 0 | 0 | 0 |
| 20.09.2023 23:00 - 24:00 | 0 | 0 | 0 | 0 |
| 21.09.2023 00:00 - 01:00 | 0 | 0 | 0 | 0 |
| 21.09.2023 01:00 - 02:00 | 0 | 0 | 0 | 0 |
| 21.09.2023 02:00 - 03:00 | 0 | 0 | 0 | 0 |
| 21.09.2023 03:00 - 04:00 | 0 | 0 | 0 | 0 |
| 21.09.2023 04:00 - 05:00 | 0 | 0 | 0 | 0 |
| 21.09.2023 05:00 - 06:00 | 0 | 0 | 0 | 0 |
| 21.09.2023 06:00 - 07:00 | 0 | 0 | 0 | 0 |
| 21.09.2023 07:00 - 08:00 | 0 | 0 | 0 | 0 |
| 21.09.2023 08:00 - 09:00 | 0 | 0 | 0 | 0 |
| 21.09.2023 09:00 - 10:00 | 0 | 0 | 0 | 0 |
| 21.09.2023 10:00 - 11:00 | 0 | 0 | 0 | 0 |
| 21.09.2023 11:00 - 12:00 | 0 | 0 | 0 | 0 |
| 21.09.2023 12:00 - 13:00 | 0 | 0 | 0 | 0 |
| 21.09.2023 13:00 - 14:00 | 0 | 0 | 0 | 0 |
| 21.09.2023 14:00 - 15:00 | 0 | 0 | 0 | 0 |
| 21.09.2023 15:00 - 16:00 | 0 | 0 | 0 | 0 |
| 21.09.2023 16:00 - 17:00 | 0 | 0 | 0 | 0 |
| 21.09.2023 17:00 - 18:00 | 0 | 0 | 0 | 0 |
| 21.09.2023 18:00 - 19:00 | 0 | 0 | 0 | 0 |
| 21.09.2023 19:00 - 20:00 | 0 | 0 | 0 | 0 |
| 21.09.2023 20:00 - 21:00 | 0 | 0 | 0 | 0 |
| 21.09.2023 21:00 - 22:00 | 0 | 0 | 0 | 0 |
| 21.09.2023 22:00 - 23:00 | 0 | 0 | 0 | 0 |
| 21.09.2023 23:00 - 24:00 | 0 | 0 | 0 | 0 |
| 22.09.2023 00:00 - 01:00 | 0 | 0 | 0 | 0 |
| 22.09.2023 01:00 - 02:00 | 0 | 0 | 0 | 0 |
| 22.09.2023 02:00 - 03:00 | 0 | 0 | 0 | 0 |
| 22.09.2023 03:00 - 04:00 | 0 | 0 | 0 | 0 |
| 22.09.2023 04:00 - 05:00 | 0 | 0 | 0 | 0 |
| 22.09.2023 05:00 - 06:00 | 0 | 0 | 0 | 0 |
| 22.09.2023 06:00 - 07:00 | 0 | 0 | 0 | 0 |
| 22.09.2023 07:00 - 08:00 | 0 | 0 | 0 | 0 |
| 22.09.2023 08:00 - 09:00 | 0 | 0 | 0 | 0 |
| 22.09.2023 09:00 - 10:00 | 0 | 0 | 0 | 0 |
| 22.09.2023 10:00 - 11:00 | 0 | 0 | 0 | 0 |
| 22.09.2023 11:00 - 12:00 | 0 | 0 | 0 | 0 |
| 22.09.2023 12:00 - 13:00 | 0 | 0 | 0 | 0 |
| 22.09.2023 13:00 - 14:00 | 0 | 0 | 0 | 0 |
| 22.09.2023 14:00 - 15:00 | 0 | 0 | 0 | 0 |
| 22.09.2023 15:00 - 16:00 | 0 | 0 | 0 | 0 |
| 22.09.2023 16:00 - 17:00 | 0 | 0 | 0 | 0 |
| 22.09.2023 17:00 - 18:00 | 0 | 0 | 0 | 0 |
| 22.09.2023 18:00 - 19:00 | 0 | 0 | 0 | 0 |
| 22.09.2023 19:00 - 20:00 | 0 | 0 | 0 | 0 |
| 22.09.2023 20:00 - 21:00 | 0 | 0 | 0 | 0 |
| 22.09.2023 21:00 - 22:00 | 0 | 0 | 0 | 0 |
| 22.09.2023 22:00 - 23:00 | 0 | 0 | 0 | 0 |
| 22.09.2023 23:00 - 24:00 | 0 | 0 | 0 | 0 |
| 23.09.2023 00:00 - 01:00 | 0 | 0 | 0 | 0 |
| 23.09.2023 01:00 - 02:00 | 0 | 0 | 0 | 0 |
| 23.09.2023 02:00 - 03:00 | 0 | 0 | 0 | 0 |
| 23.09.2023 03:00 - 04:00 | 0 | 0 | 0 | 0 |
| 23.09.2023 04:00 - 05:00 | 0 | 0 | 0 | 0 |
| 23.09.2023 05:00 - 06:00 | 0 | 0 | 0 | 0 |
| 23.09.2023 06:00 - 07:00 | 0 | 0 | 0 | 0 |
| 23.09.2023 07:00 - 08:00 | 0 | 0 | 0 | 0 |
| 23.09.2023 08:00 - 09:00 | 0 | 0 | 0 | 0 |
| 23.09.2023 09:00 - 10:00 | 0 | 0 | 0 | 0 |
| 23.09.2023 10:00 - 11:00 | 0 | 0 | 0 | 0 |
| 23.09.2023 11:00 - 12:00 | 0 | 0 | 0 | 0 |
| 23.09.2023 12:00 - 13:00 | 0 | 0 | 0 | 0 |
| 23.09.2023 13:00 - 14:00 | 0 | 0 | 0 | 0 |
| 23.09.2023 14:00 - 15:00 | 0 | 0 | 0 | 0 |
| 23.09.2023 15:00 - 16:00 | 0 | 0 | 0 | 0 |
| 23.09.2023 16:00 - 17:00 | 0 | 0 | 0 | 0 |
| 23.09.2023 17:00 - 18:00 | 0 | 0 | 0 | 0 |
| 23.09.2023 18:00 - 19:00 | 0 | 0 | 0 | 0 |
| 23.09.2023 19:00 - 20:00 | 0 | 0 | 0 | 0 |
| 23.09.2023 20:00 - 21:00 | 0 | 0 | 0 | 0 |
| 23.09.2023 21:00 - 22:00 | 0 | 0 | 0 | 0 |
| 23.09.2023 22:00 - 23:00 | 0 | 0 | 0 | 0 |
| 23.09.2023 23:00 - 24:00 | 0 | 0 | 0 | 0 |
| 24.09.2023 00:00 - 01:00 | 0 | 0 | 0 | 0 |
| 24.09.2023 01:00 - 02:00 | 0 | 0 | 0 | 0 |
| 24.09.2023 02:00 - 03:00 | 0 | 0 | 0 | 0 |
| 24.09.2023 03:00 - 04:00 | 0 | 0 | 0 | 0 |
| 24.09.2023 04:00 - 05:00 | 0 | 0 | 0 | 0 |
| 24.09.2023 05:00 - 06:00 | 0 | 0 | 0 | 0 |
| 24.09.2023 06:00 - 07:00 | 0 | 0 | 0 | 0 |
| 24.09.2023 07:00 - 08:00 | 0 | 0 | 0 | 0 |
| 24.09.2023 08:00 - 09:00 | 0 | 0 | 0 | 0 |
| 24.09.2023 09:00 - 10:00 | 0 | 0 | 0 | 0 |
| 24.09.2023 10:00 - 11:00 | 0 | 0 | 0 | 0 |
| 24.09.2023 11:00 - 12:00 | 0 | 0 | 0 | 0 |
| 24.09.2023 12:00 - 13:00 | 0 | 0 | 0 | 0 |
| 24.09.2023 13:00 - 14:00 | 0 | 0 | 0 | 0 |
| 24.09.2023 14:00 - 15:00 | 0 | 0 | 0 | 0 |
| 24.09.2023 15:00 - 16:00 | 0 | -30 | 0 | 0 |
| 24.09.2023 16:00 - 17:00 | 0 | -30 | 0 | 0 |
| 24.09.2023 17:00 - 18:00 | 0 | -30 | 0 | 0 |
| 24.09.2023 18:00 - 19:00 | 0 | -30 | 0 | 0 |
| 24.09.2023 19:00 - 20:00 | 0 | -30 | 0 | 0 |
| 24.09.2023 20:00 - 21:00 | 0 | -30 | 0 | 0 |
| 24.09.2023 21:00 - 22:00 | 0 | -30 | 0 | 0 |
| 24.09.2023 22:00 - 23:00 | 0 | -30 | 0 | 0 |
| 24.09.2023 23:00 - 24:00 | 0 | -30 | 0 | 0 |
| 25.09.2023 00:00 - 01:00 | 0 | -30 | 0 | 0 |
| 25.09.2023 01:00 - 02:00 | 0 | -30 | 0 | 0 |
| 25.09.2023 02:00 - 03:00 | 0 | -30 | 0 | 0 |
| 25.09.2023 03:00 - 04:00 | 0 | -30 | 0 | 0 |
| 25.09.2023 04:00 - 05:00 | 0 | -30 | 0 | 0 |
| 25.09.2023 05:00 - 06:00 | 0 | -30 | 0 | 0 |
| 25.09.2023 06:00 - 07:00 | 0 | 0 | 0 | 0 |
| 25.09.2023 07:00 - 08:00 | 0 | 0 | 0 | 0 |
| 25.09.2023 08:00 - 09:00 | 0 | 0 | 0 | 0 |
| 25.09.2023 09:00 - 10:00 | 0 | 0 | 0 | 0 |
| 25.09.2023 10:00 - 11:00 | 0 | 0 | 0 | 0 |
| 25.09.2023 11:00 - 12:00 | 0 | 0 | 0 | 0 |
| 25.09.2023 12:00 - 13:00 | 0 | 0 | 0 | 0 |
| 25.09.2023 13:00 - 14:00 | 0 | 0 | 0 | 0 |
| 25.09.2023 14:00 - 15:00 | 0 | 0 | 0 | 0 |
| 25.09.2023 15:00 - 16:00 | 0 | 0 | 0 | 0 |
| 25.09.2023 16:00 - 17:00 | 0 | 0 | 0 | 0 |
| 25.09.2023 17:00 - 18:00 | 0 | 0 | 0 | 0 |
| 25.09.2023 18:00 - 19:00 | 0 | 0 | 0 | 0 |
| 25.09.2023 19:00 - 20:00 | 0 | 0 | 0 | 0 |
| 25.09.2023 20:00 - 21:00 | 0 | 0 | 0 | 0 |
| 25.09.2023 21:00 - 22:00 | 0 | 0 | 0 | 0 |
| 25.09.2023 22:00 - 23:00 | 0 | 0 | 0 | 0 |
| 25.09.2023 23:00 - 24:00 | 0 | 0 | 0 | 0 |
| 26.09.2023 00:00 - 01:00 | 0 | 0 | 0 | 0 |
| 26.09.2023 01:00 - 02:00 | 0 | 0 | 0 | 0 |
| 26.09.2023 02:00 - 03:00 | 0 | 0 | 0 | 0 |
| 26.09.2023 03:00 - 04:00 | 100 | 0 | 0 | 0 |
| 26.09.2023 04:00 - 05:00 | 100 | 0 | 0 | 0 |
| 26.09.2023 05:00 - 06:00 | 100 | 0 | 0 | 0 |
| 26.09.2023 06:00 - 07:00 | 0 | 0 | 0 | 0 |
| 26.09.2023 07:00 - 08:00 | 0 | 0 | 0 | 0 |
| 26.09.2023 08:00 - 09:00 | 0 | 0 | 0 | 0 |
| 26.09.2023 09:00 - 10:00 | 0 | 0 | 0 | 0 |
| 26.09.2023 10:00 - 11:00 | 0 | 0 | 0 | 0 |
| 26.09.2023 11:00 - 12:00 | 0 | 0 | 0 | 0 |
| 26.09.2023 12:00 - 13:00 | 0 | 0 | 0 | 0 |
| 26.09.2023 13:00 - 14:00 | 0 | 0 | 0 | 0 |
| 26.09.2023 14:00 - 15:00 | 0 | 0 | 0 | 0 |
| 26.09.2023 15:00 - 16:00 | 0 | 0 | 0 | 0 |
| 26.09.2023 16:00 - 17:00 | 0 | 0 | 0 | 0 |
| 26.09.2023 17:00 - 18:00 | 0 | 0 | 0 | 0 |
| 26.09.2023 18:00 - 19:00 | 0 | 0 | 0 | 0 |
| 26.09.2023 19:00 - 20:00 | 30 | 0 | 0 | 0 |
| 26.09.2023 20:00 - 21:00 | 30 | 0 | 0 | 0 |
| 26.09.2023 21:00 - 22:00 | 70 | 0 | 0 | 0 |
| 26.09.2023 22:00 - 23:00 | 70 | 0 | 0 | 0 |
| 26.09.2023 23:00 - 24:00 | 110 | 0 | 0 | 0 |
| 27.09.2023 00:00 - 01:00 | 110 | 0 | 0 | 0 |
| 27.09.2023 01:00 - 02:00 | 110 | 0 | 0 | 0 |
| 27.09.2023 02:00 - 03:00 | 110 | 0 | 0 | 0 |
| 27.09.2023 03:00 - 04:00 | 110 | 0 | 0 | 0 |
| 27.09.2023 04:00 - 05:00 | 110 | 0 | 0 | 0 |
| 27.09.2023 05:00 - 06:00 | 110 | 0 | 0 | 0 |
| 27.09.2023 06:00 - 07:00 | 0 | 0 | 0 | 0 |
| 27.09.2023 07:00 - 08:00 | 0 | 0 | 0 | 0 |
| 27.09.2023 08:00 - 09:00 | 0 | 0 | 0 | 0 |
| 27.09.2023 09:00 - 10:00 | 0 | 0 | 0 | 0 |
| 27.09.2023 10:00 - 11:00 | 0 | 0 | 0 | 0 |
| 27.09.2023 11:00 - 12:00 | 0 | 0 | 0 | 0 |
| 27.09.2023 12:00 - 13:00 | 0 | 0 | 0 | 0 |
| 27.09.2023 13:00 - 14:00 | 0 | 0 | 0 | 0 |
| 27.09.2023 14:00 - 15:00 | 0 | 0 | 0 | 0 |
| 27.09.2023 15:00 - 16:00 | 0 | 0 | 0 | 0 |
| 27.09.2023 16:00 - 17:00 | 0 | 0 | 0 | 0 |
| 27.09.2023 17:00 - 18:00 | 0 | 0 | 0 | 0 |
| 27.09.2023 18:00 - 19:00 | 50 | 0 | 0 | 0 |
| 27.09.2023 19:00 - 20:00 | 50 | 0 | 0 | 0 |
| 27.09.2023 20:00 - 21:00 | 50 | 0 | 0 | 0 |
| 27.09.2023 21:00 - 22:00 | 50 | 0 | 0 | 0 |
| 27.09.2023 22:00 - 23:00 | 50 | 0 | 0 | 0 |
| 27.09.2023 23:00 - 24:00 | 50 | 0 | 0 | 0 |
| 28.09.2023 00:00 - 01:00 | 50 | 0 | 0 | 0 |
| 28.09.2023 01:00 - 02:00 | 50 | 0 | 0 | 0 |
| 28.09.2023 02:00 - 03:00 | 50 | 0 | 0 | 0 |
| 28.09.2023 03:00 - 04:00 | 50 | 0 | 0 | 0 |
| 28.09.2023 04:00 - 05:00 | 50 | 0 | 0 | 0 |
| 28.09.2023 05:00 - 06:00 | 50 | 0 | 0 | 0 |
| 28.09.2023 06:00 - 07:00 | 0 | 0 | 0 | 0 |
| 28.09.2023 07:00 - 08:00 | 0 | 0 | 0 | 0 |
| 28.09.2023 08:00 - 09:00 | 0 | 0 | 0 | 0 |
| 28.09.2023 09:00 - 10:00 | 0 | 0 | 0 | 0 |
| 28.09.2023 10:00 - 11:00 | 0 | 0 | 0 | 0 |
| 28.09.2023 11:00 - 12:00 | 0 | 0 | 0 | 0 |
| 28.09.2023 12:00 - 13:00 | 0 | 0 | 0 | 0 |
| 28.09.2023 13:00 - 14:00 | 0 | 0 | 0 | 0 |
| 28.09.2023 14:00 - 15:00 | 0 | 0 | 0 | 0 |
| 28.09.2023 15:00 - 16:00 | 0 | 0 | 0 | 0 |
| 28.09.2023 16:00 - 17:00 | 0 | 0 | 0 | 0 |
| 28.09.2023 17:00 - 18:00 | 0 | 0 | 0 | 0 |
| 28.09.2023 18:00 - 19:00 | 0 | 0 | 0 | 0 |
| 28.09.2023 19:00 - 20:00 | 0 | 0 | 0 | 0 |
| 28.09.2023 20:00 - 21:00 | 0 | 0 | 0 | 0 |
| 28.09.2023 21:00 - 22:00 | 0 | 0 | 0 | 0 |
| 28.09.2023 22:00 - 23:00 | 0 | 0 | 0 | 0 |
| 28.09.2023 23:00 - 24:00 | 0 | 0 | 0 | 0 |
| 29.09.2023 00:00 - 01:00 | 0 | 0 | 0 | 0 |
| 29.09.2023 01:00 - 02:00 | 50 | 0 | 0 | 0 |
| 29.09.2023 02:00 - 03:00 | 50 | 0 | 0 | 0 |
| 29.09.2023 03:00 - 04:00 | 50 | 0 | 0 | 0 |
| 29.09.2023 04:00 - 05:00 | 50 | 0 | 0 | 0 |
| 29.09.2023 05:00 - 06:00 | 50 | 0 | 0 | 0 |
| 29.09.2023 06:00 - 07:00 | 0 | 0 | 0 | 0 |
| 29.09.2023 07:00 - 08:00 | 0 | 0 | 0 | 0 |
| 29.09.2023 08:00 - 09:00 | 0 | 0 | 0 | 0 |
| 29.09.2023 09:00 - 10:00 | 0 | 0 | 0 | 0 |
| 29.09.2023 10:00 - 11:00 | 0 | 0 | 0 | 0 |
| 29.09.2023 11:00 - 12:00 | 0 | 0 | 0 | 0 |
| 29.09.2023 12:00 - 13:00 | 0 | 0 | 0 | 0 |
| 29.09.2023 13:00 - 14:00 | 0 | 0 | 0 | 0 |
| 29.09.2023 14:00 - 15:00 | 0 | 0 | 0 | 0 |
| 29.09.2023 15:00 - 16:00 | 0 | 0 | 0 | 0 |
| 29.09.2023 16:00 - 17:00 | 0 | 0 | 0 | 0 |
| 29.09.2023 17:00 - 18:00 | 0 | 0 | 0 | 0 |
| 29.09.2023 18:00 - 19:00 | 0 | 0 | 0 | 0 |
| 29.09.2023 19:00 - 20:00 | 0 | 0 | 0 | 0 |
| 29.09.2023 20:00 - 21:00 | 0 | 0 | 0 | 0 |
| 29.09.2023 21:00 - 22:00 | 0 | 0 | 0 | 0 |
| 29.09.2023 22:00 - 23:00 | 0 | 0 | 0 | 0 |
| 29.09.2023 23:00 - 24:00 | 0 | 0 | 0 | 0 |
| 30.09.2023 00:00 - 01:00 | 0 | 0 | 0 | 0 |
| 30.09.2023 01:00 - 02:00 | 0 | 0 | 0 | 0 |
| 30.09.2023 02:00 - 03:00 | 0 | 0 | 0 | 0 |
| 30.09.2023 03:00 - 04:00 | 0 | 0 | 0 | 0 |
| 30.09.2023 04:00 - 05:00 | 0 | 0 | 0 | 0 |
| 30.09.2023 05:00 - 06:00 | 0 | 0 | 0 | 0 |
| 30.09.2023 06:00 - 07:00 | 0 | 0 | 0 | 0 |
| 30.09.2023 07:00 - 08:00 | 0 | 0 | 0 | 0 |
| 30.09.2023 08:00 - 09:00 | 0 | 0 | 0 | 0 |
| 30.09.2023 09:00 - 10:00 | 0 | 0 | 0 | 0 |
| 30.09.2023 10:00 - 11:00 | 0 | 0 | 0 | 0 |
| 30.09.2023 11:00 - 12:00 | 0 | 0 | 0 | 0 |
| 30.09.2023 12:00 - 13:00 | 0 | 0 | 0 | 0 |
| 30.09.2023 13:00 - 14:00 | 0 | 0 | 0 | 0 |
| 30.09.2023 14:00 - 15:00 | 0 | 0 | 0 | 0 |
| 30.09.2023 15:00 - 16:00 | 0 | 0 | 0 | 0 |
| 30.09.2023 16:00 - 17:00 | 0 | 0 | 0 | 0 |
| 30.09.2023 17:00 - 18:00 | 0 | 0 | 0 | 0 |
| 30.09.2023 18:00 - 19:00 | 0 | 0 | 0 | 0 |
| 30.09.2023 19:00 - 20:00 | 0 | 0 | 0 | 0 |
| 30.09.2023 20:00 - 21:00 | 0 | 0 | 0 | 0 |
| 30.09.2023 21:00 - 22:00 | 0 | 0 | 0 | 0 |
| 30.09.2023 22:00 - 23:00 | 0 | -30 | 0 | 0 |
| 30.09.2023 23:00 - 24:00 | 0 | -30 | 0 | 0 |
| 01.10.2023 00:00 - 01:00 | 0 | -30 | 0 | 0 |
| 01.10.2023 01:00 - 02:00 | 0 | -30 | 0 | 0 |
| 01.10.2023 02:00 - 03:00 | 0 | -30 | 0 | 0 |
| 01.10.2023 03:00 - 04:00 | 0 | -30 | 0 | 0 |
| 01.10.2023 04:00 - 05:00 | 0 | -30 | 0 | 0 |
| 01.10.2023 05:00 - 06:00 | 0 | -30 | 0 | 0 |